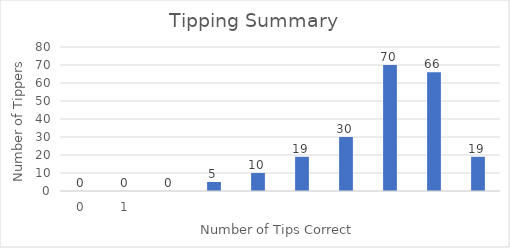
| Category | Count |
|---|---|
| 0.0 | 0 |
| 1.0 | 0 |
| nan | 0 |
| nan | 5 |
| nan | 10 |
| nan | 19 |
| nan | 30 |
| nan | 70 |
| nan | 66 |
| nan | 19 |